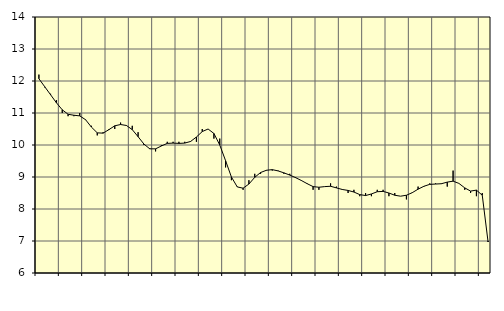
| Category | Piggar | Tillverkning av verkstadsvaror, SNI 25-30, 33 |
|---|---|---|
| nan | 12.2 | 12.07 |
| 1.0 | 11.8 | 11.82 |
| 1.0 | 11.6 | 11.57 |
| 1.0 | 11.4 | 11.32 |
| nan | 11 | 11.1 |
| 2.0 | 10.9 | 10.96 |
| 2.0 | 10.9 | 10.93 |
| 2.0 | 11 | 10.91 |
| nan | 10.8 | 10.79 |
| 3.0 | 10.6 | 10.56 |
| 3.0 | 10.3 | 10.38 |
| 3.0 | 10.4 | 10.37 |
| nan | 10.5 | 10.48 |
| 4.0 | 10.5 | 10.6 |
| 4.0 | 10.7 | 10.64 |
| 4.0 | 10.6 | 10.61 |
| nan | 10.6 | 10.48 |
| 5.0 | 10.4 | 10.26 |
| 5.0 | 10 | 10.03 |
| 5.0 | 9.9 | 9.88 |
| nan | 9.8 | 9.88 |
| 6.0 | 10 | 9.97 |
| 6.0 | 10.1 | 10.05 |
| 6.0 | 10.1 | 10.06 |
| nan | 10.1 | 10.05 |
| 7.0 | 10.1 | 10.06 |
| 7.0 | 10.1 | 10.11 |
| 7.0 | 10.1 | 10.25 |
| nan | 10.5 | 10.42 |
| 8.0 | 10.5 | 10.5 |
| 8.0 | 10.2 | 10.36 |
| 8.0 | 10.2 | 10 |
| nan | 9.3 | 9.51 |
| 9.0 | 8.9 | 9 |
| 9.0 | 8.7 | 8.69 |
| 9.0 | 8.6 | 8.65 |
| nan | 8.9 | 8.78 |
| 10.0 | 9.1 | 8.99 |
| 10.0 | 9.1 | 9.14 |
| 10.0 | 9.2 | 9.21 |
| nan | 9.2 | 9.23 |
| 11.0 | 9.2 | 9.19 |
| 11.0 | 9.1 | 9.13 |
| 11.0 | 9.1 | 9.06 |
| nan | 9 | 8.98 |
| 12.0 | 8.9 | 8.89 |
| 12.0 | 8.8 | 8.79 |
| 12.0 | 8.6 | 8.7 |
| nan | 8.6 | 8.68 |
| 13.0 | 8.7 | 8.7 |
| 13.0 | 8.8 | 8.71 |
| 13.0 | 8.7 | 8.66 |
| nan | 8.6 | 8.61 |
| 14.0 | 8.5 | 8.58 |
| 14.0 | 8.6 | 8.53 |
| 14.0 | 8.4 | 8.45 |
| nan | 8.5 | 8.42 |
| 15.0 | 8.4 | 8.47 |
| 15.0 | 8.6 | 8.54 |
| 15.0 | 8.6 | 8.55 |
| nan | 8.4 | 8.5 |
| 16.0 | 8.5 | 8.43 |
| 16.0 | 8.4 | 8.4 |
| 16.0 | 8.3 | 8.43 |
| nan | 8.5 | 8.51 |
| 17.0 | 8.7 | 8.62 |
| 17.0 | 8.7 | 8.71 |
| 17.0 | 8.8 | 8.77 |
| nan | 8.8 | 8.78 |
| 18.0 | 8.8 | 8.79 |
| 18.0 | 8.7 | 8.84 |
| 18.0 | 9.2 | 8.87 |
| nan | 8.8 | 8.8 |
| 19.0 | 8.6 | 8.66 |
| 19.0 | 8.5 | 8.56 |
| 19.0 | 8.4 | 8.59 |
| nan | 8.5 | 8.43 |
| 20.0 | 7 | 6.97 |